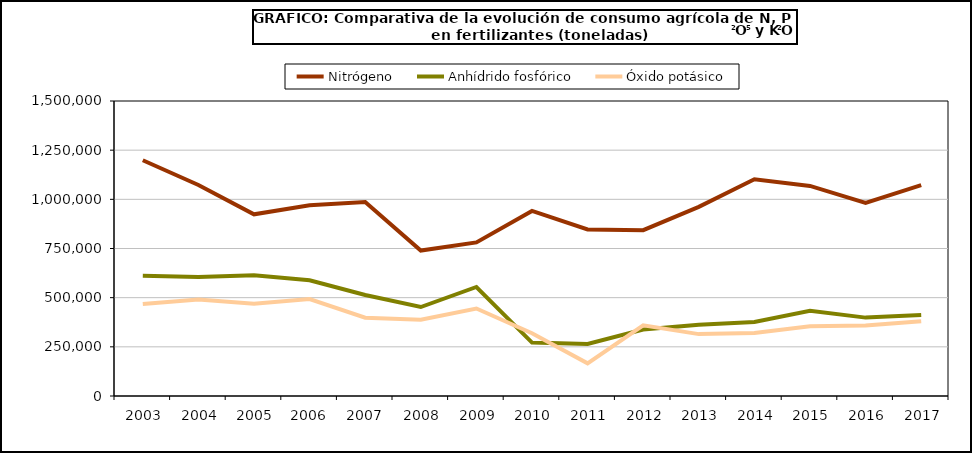
| Category | Nitrógeno | Anhídrido fosfórico | Óxido potásico |
|---|---|---|---|
|   2003 | 1198606 |  |  |
|   2004 | 1072949 |  |  |
|   2005 | 923764 |  |  |
|   2006  | 969783 |  |  |
|   2007  | 985857 |  |  |
|   2008 | 739757 |  |  |
|   2009 | 781069 |  |  |
|   2010 | 940984 |  |  |
|   2011 | 846697 |  |  |
|   2012 | 843410 |  |  |
|   2013 | 961507 |  |  |
|   2014 | 1101895 |  |  |
|   2015 | 1068103 |  |  |
|   2016 | 982155 |  |  |
|   2017 | 1072125 |  |  |